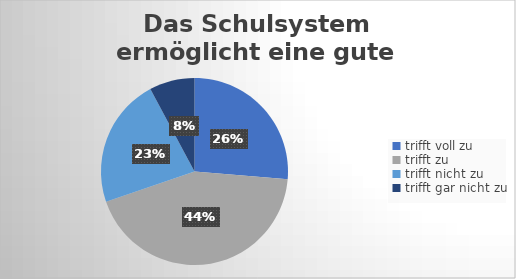
| Category | Das Schulsystem ermöglicht eine gute Bildung. |
|---|---|
| trifft voll zu | 74 |
| trifft zu  | 122 |
| trifft nicht zu  | 63 |
| trifft gar nicht zu | 22 |